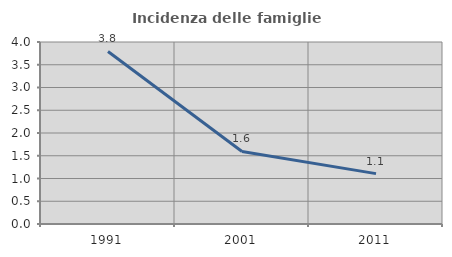
| Category | Incidenza delle famiglie numerose |
|---|---|
| 1991.0 | 3.793 |
| 2001.0 | 1.595 |
| 2011.0 | 1.107 |